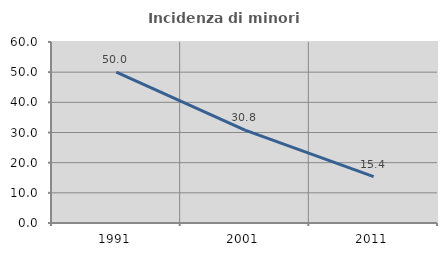
| Category | Incidenza di minori stranieri |
|---|---|
| 1991.0 | 50 |
| 2001.0 | 30.769 |
| 2011.0 | 15.385 |